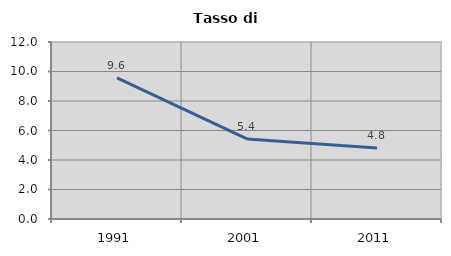
| Category | Tasso di disoccupazione   |
|---|---|
| 1991.0 | 9.571 |
| 2001.0 | 5.429 |
| 2011.0 | 4.816 |